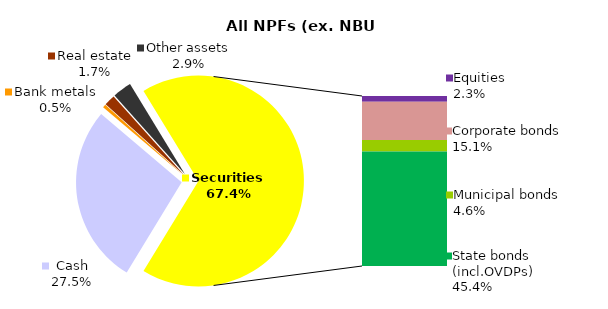
| Category | All NPF (ex. NBU CNPF) |
|---|---|
| Cash | 582.86 |
| Bank metals | 10.307 |
| Real estate | 36.037 |
| Other assets | 61.754 |
| Equities | 48.773 |
| Corporate bonds | 321.368 |
| Municipal bonds | 96.616 |
| State bonds (incl.OVDPs) | 963.689 |